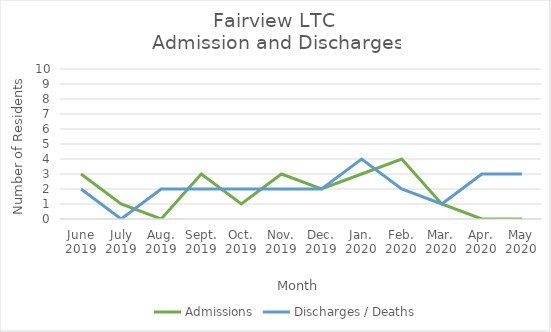
| Category | Admissions | Discharges / Deaths |
|---|---|---|
| June
2019 | 3 | 2 |
| July
2019 | 1 | 0 |
| Aug.
2019 | 0 | 2 |
| Sept.
2019 | 3 | 2 |
| Oct.
2019 | 1 | 2 |
| Nov.
2019 | 3 | 2 |
| Dec.
2019 | 2 | 2 |
| Jan.
2020 | 3 | 4 |
| Feb.
2020 | 4 | 2 |
| Mar.
2020 | 1 | 1 |
| Apr.
2020 | 0 | 3 |
| May
2020 | 0 | 3 |